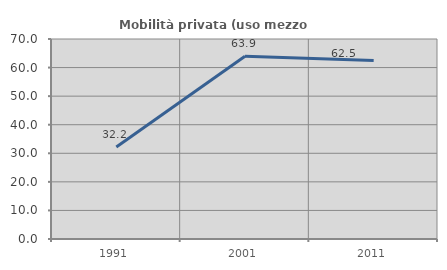
| Category | Mobilità privata (uso mezzo privato) |
|---|---|
| 1991.0 | 32.203 |
| 2001.0 | 63.934 |
| 2011.0 | 62.5 |